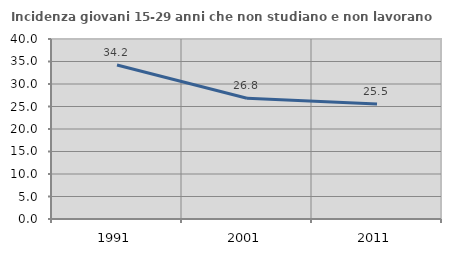
| Category | Incidenza giovani 15-29 anni che non studiano e non lavorano  |
|---|---|
| 1991.0 | 34.211 |
| 2001.0 | 26.822 |
| 2011.0 | 25.538 |